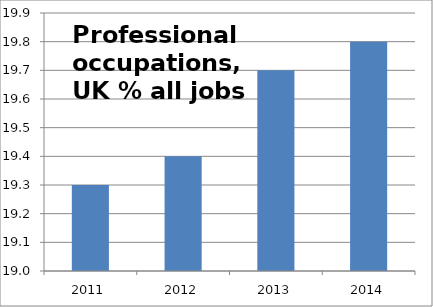
| Category | 2: Professional occupations |
|---|---|
| 2011.0 | 19.3 |
| 2012.0 | 19.4 |
| 2013.0 | 19.7 |
| 2014.0 | 19.8 |